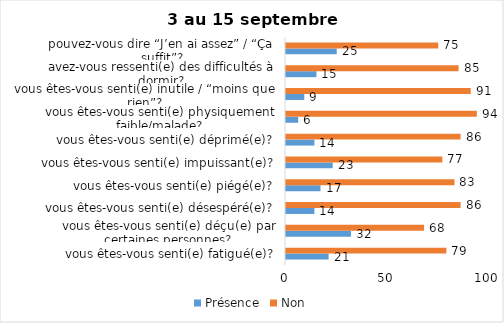
| Category | Présence | Non |
|---|---|---|
| vous êtes-vous senti(e) fatigué(e)? | 21 | 79 |
| vous êtes-vous senti(e) déçu(e) par certaines personnes? | 32 | 68 |
| vous êtes-vous senti(e) désespéré(e)? | 14 | 86 |
| vous êtes-vous senti(e) piégé(e)? | 17 | 83 |
| vous êtes-vous senti(e) impuissant(e)? | 23 | 77 |
| vous êtes-vous senti(e) déprimé(e)? | 14 | 86 |
| vous êtes-vous senti(e) physiquement faible/malade? | 6 | 94 |
| vous êtes-vous senti(e) inutile / “moins que rien”? | 9 | 91 |
| avez-vous ressenti(e) des difficultés à dormir? | 15 | 85 |
| pouvez-vous dire “J’en ai assez” / “Ça suffit”? | 25 | 75 |